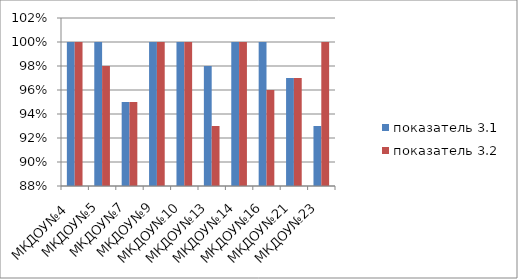
| Category | показатель 3.1 | показатель 3.2 |
|---|---|---|
| МКДОУ№4  | 1 | 1 |
| МКДОУ№5 | 1 | 0.98 |
| МКДОУ№7 | 0.95 | 0.95 |
| МКДОУ№9 | 1 | 1 |
| МКДОУ№10 | 1 | 1 |
| МКДОУ№13 | 0.98 | 0.93 |
| МКДОУ№14 | 1 | 1 |
| МКДОУ№16 | 1 | 0.96 |
| МКДОУ№21 | 0.97 | 0.97 |
| МКДОУ№23 | 0.93 | 1 |